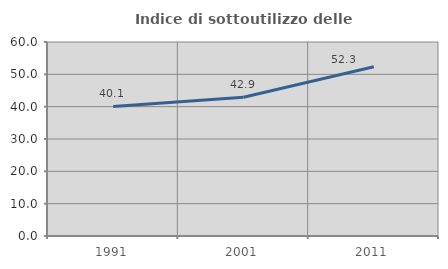
| Category | Indice di sottoutilizzo delle abitazioni  |
|---|---|
| 1991.0 | 40.088 |
| 2001.0 | 42.913 |
| 2011.0 | 52.344 |